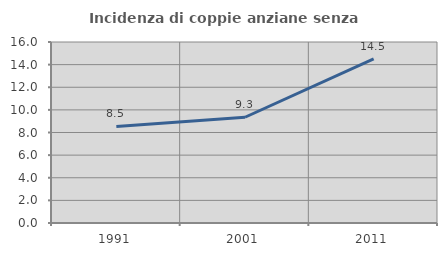
| Category | Incidenza di coppie anziane senza figli  |
|---|---|
| 1991.0 | 8.537 |
| 2001.0 | 9.348 |
| 2011.0 | 14.51 |